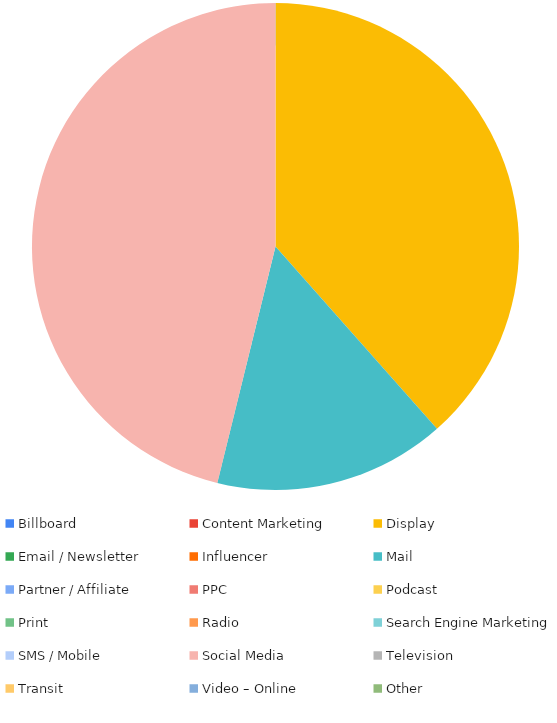
| Category | Series 0 |
|---|---|
| Billboard | 0 |
| Content Marketing | 0 |
| Display | 250 |
| Email / Newsletter | 0 |
| Influencer | 0 |
| Mail | 100 |
| Partner / Affiliate | 0 |
| PPC | 0 |
| Podcast | 0 |
| Print | 0 |
| Radio | 0 |
| Search Engine Marketing | 0 |
| SMS / Mobile | 0 |
| Social Media | 300 |
| Television | 0 |
| Transit | 0 |
| Video – Online | 0 |
| Other | 0 |